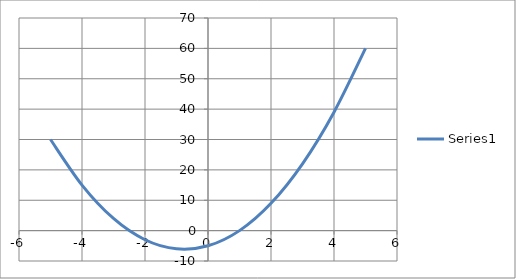
| Category | Series 0 |
|---|---|
| -5.0 | 30 |
| -4.0 | 15 |
| -3.0 | 4 |
| -2.0 | -3 |
| -1.0 | -6 |
| 0.0 | -5 |
| 1.0 | 0 |
| 2.0 | 9 |
| 3.0 | 22 |
| 4.0 | 39 |
| 5.0 | 60 |